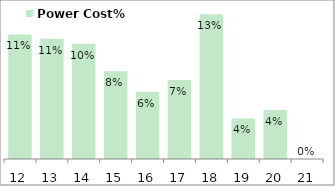
| Category | Power Cost% |
|---|---|
| 2012-03-31 | 0.112 |
| 2013-03-31 | 0.108 |
| 2014-03-31 | 0.103 |
| 2015-03-31 | 0.079 |
| 2016-03-31 | 0.06 |
| 2017-03-31 | 0.071 |
| 2018-03-31 | 0.13 |
| 2019-03-31 | 0.036 |
| 2020-03-31 | 0.044 |
| 2021-03-31 | 0 |